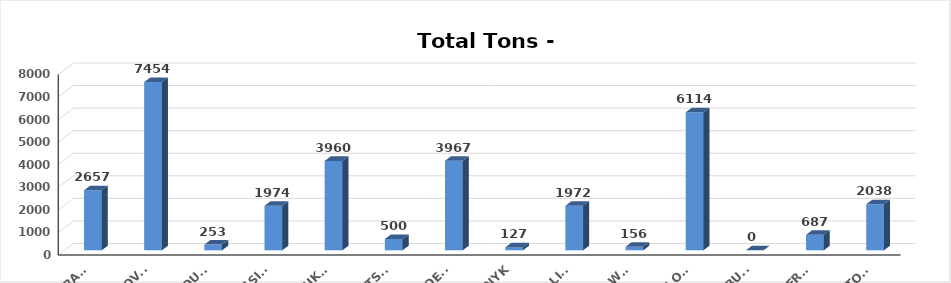
| Category | Series 0 |
|---|---|
| TRAMP | 2657 |
| GLOVIS | 7454 |
| HAPAG LIOUYD | 253 |
| MESSINA | 1974 |
| EUKOR | 3960 |
| MITSUI | 500 |
| HUAL-HOEGH | 3967 |
| NYK | 127 |
| K-LINE | 1972 |
| WWL | 156 |
| LIBERTY GLOBA | 6114 |
| COSCO BULK | 0 |
| LIBERTY | 687 |
| HOEGH AUTOLIN | 2038 |